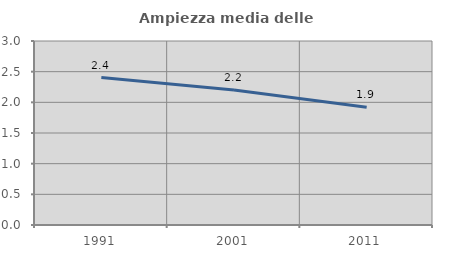
| Category | Ampiezza media delle famiglie |
|---|---|
| 1991.0 | 2.404 |
| 2001.0 | 2.2 |
| 2011.0 | 1.921 |